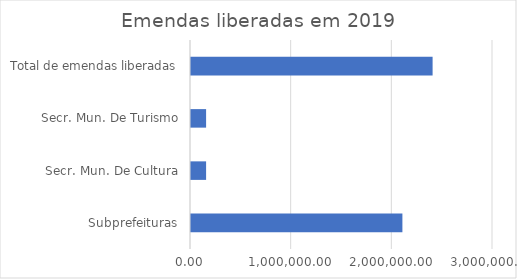
| Category | Series 0 |
|---|---|
| Subprefeituras | 2100000 |
| Secr. Mun. De Cultura | 150000 |
| Secr. Mun. De Turismo | 150000 |
| Total de emendas liberadas | 2400000 |